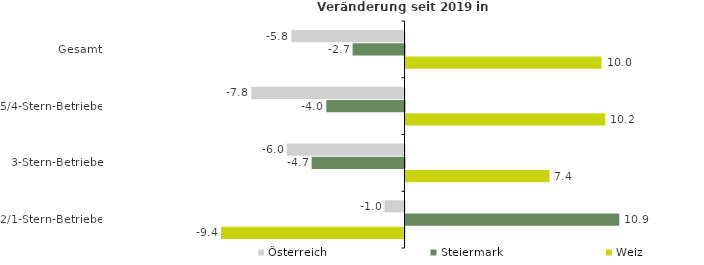
| Category | Österreich | Steiermark | Weiz |
|---|---|---|---|
| Gesamt | -5.779 | -2.653 | 10.017 |
| 5/4-Stern-Betriebe | -7.825 | -3.996 | 10.206 |
| 3-Stern-Betriebe | -6.014 | -4.748 | 7.356 |
| 2/1-Stern-Betriebe | -1.021 | 10.926 | -9.378 |